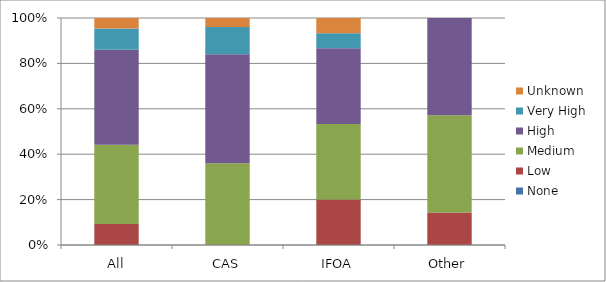
| Category | None | Low | Medium | High | Very High | Unknown |
|---|---|---|---|---|---|---|
| All | 0 | 0.093 | 0.349 | 0.419 | 0.093 | 0.047 |
| CAS | 0 | 0 | 0.36 | 0.48 | 0.12 | 0.04 |
| IFOA | 0 | 0.2 | 0.333 | 0.333 | 0.067 | 0.067 |
| Other | 0 | 0.143 | 0.429 | 0.429 | 0 | 0 |